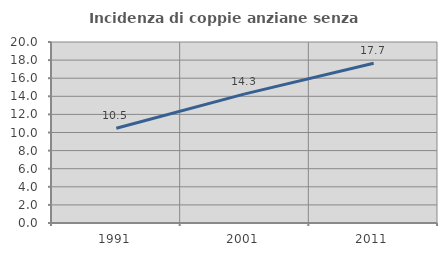
| Category | Incidenza di coppie anziane senza figli  |
|---|---|
| 1991.0 | 10.468 |
| 2001.0 | 14.27 |
| 2011.0 | 17.66 |